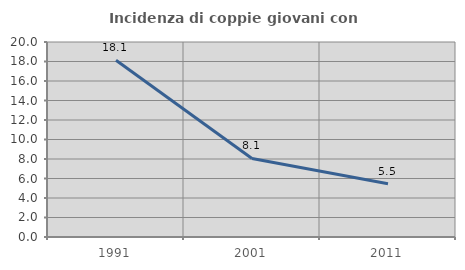
| Category | Incidenza di coppie giovani con figli |
|---|---|
| 1991.0 | 18.129 |
| 2001.0 | 8.054 |
| 2011.0 | 5.455 |